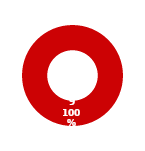
| Category | SA |
|---|---|
| MIL 2 Complete | 0 |
| MIL 2 Not Complete | 9 |